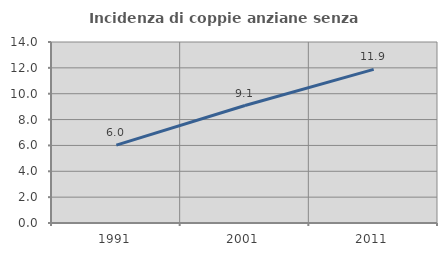
| Category | Incidenza di coppie anziane senza figli  |
|---|---|
| 1991.0 | 6.023 |
| 2001.0 | 9.088 |
| 2011.0 | 11.879 |